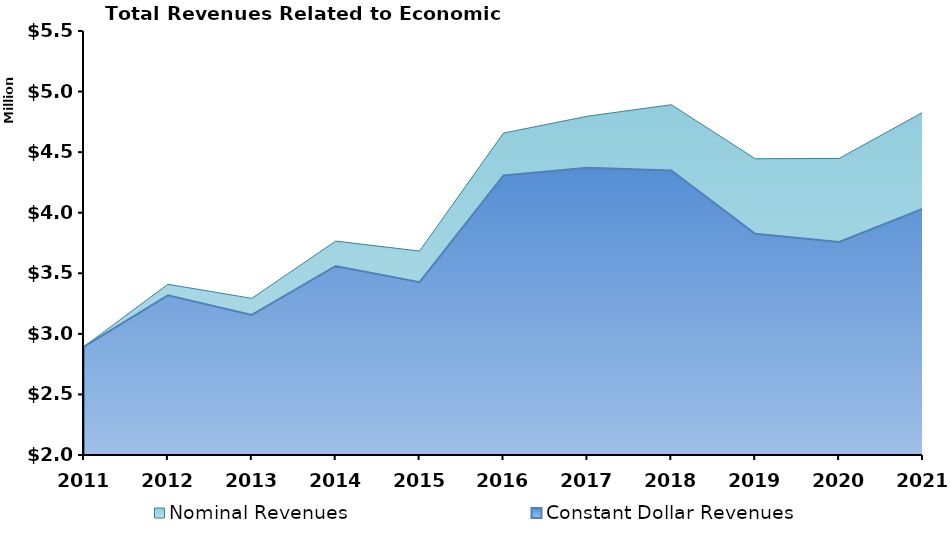
| Category | Nominal Revenues | Constant Dollar Revenues |
|---|---|---|
| 2011.0 | 2895146 | 2895146 |
| 2012.0 | 3409290 | 3318431.513 |
| 2013.0 | 3292778 | 3155855.863 |
| 2014.0 | 3765658 | 3560062.161 |
| 2015.0 | 3683472 | 3426552.715 |
| 2016.0 | 4657544 | 4307366.364 |
| 2017.0 | 4796530 | 4371194.71 |
| 2018.0 | 4891468 | 4349192.896 |
| 2019.0 | 4445495 | 3826542.832 |
| 2020.0 | 4448053 | 3757892.463 |
| 2021.0 | 4829554 | 4032838.972 |